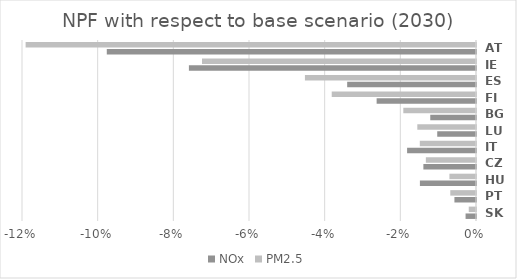
| Category | NOx | PM2.5 |
|---|---|---|
| SK | -0.003 | -0.002 |
| PT | -0.006 | -0.007 |
| HU | -0.015 | -0.007 |
| CZ | -0.014 | -0.013 |
| IT | -0.018 | -0.015 |
| LU | -0.01 | -0.016 |
| BG | -0.012 | -0.019 |
| FI | -0.026 | -0.038 |
| ES | -0.034 | -0.045 |
| IE | -0.076 | -0.072 |
| AT | -0.098 | -0.119 |